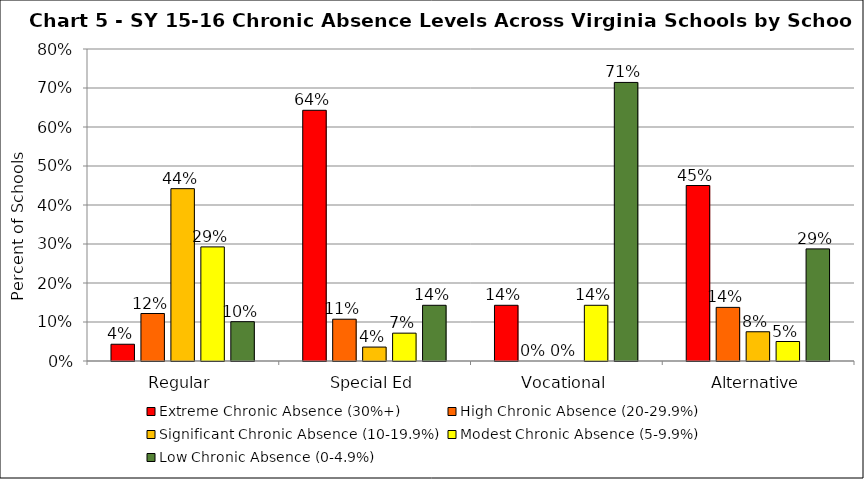
| Category | Extreme Chronic Absence (30%+) | High Chronic Absence (20-29.9%) | Significant Chronic Absence (10-19.9%) | Modest Chronic Absence (5-9.9%) | Low Chronic Absence (0-4.9%) |
|---|---|---|---|---|---|
| 0 | 0.043 | 0.122 | 0.442 | 0.293 | 0.101 |
| 1 | 0.643 | 0.107 | 0.036 | 0.071 | 0.143 |
| 2 | 0.143 | 0 | 0 | 0.143 | 0.714 |
| 3 | 0.45 | 0.138 | 0.075 | 0.05 | 0.288 |